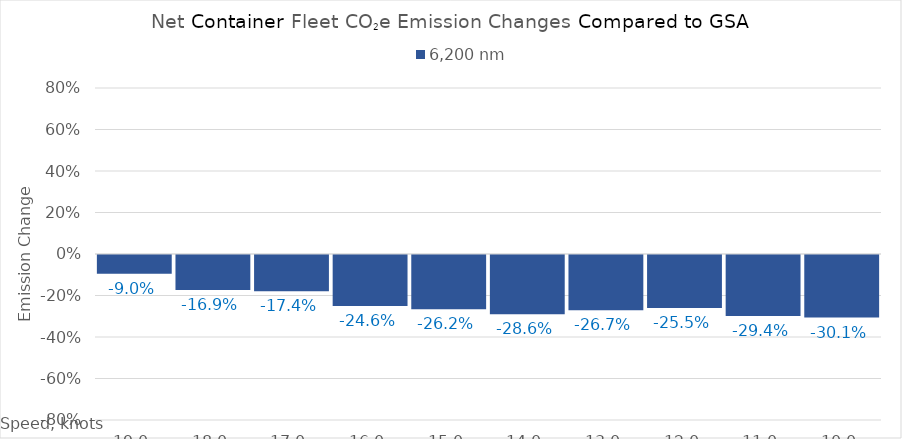
| Category | 6,200 |
|---|---|
| 19.0 | -0.09 |
| 18.0 | -0.169 |
| 17.0 | -0.174 |
| 16.0 | -0.246 |
| 15.0 | -0.262 |
| 14.0 | -0.286 |
| 13.0 | -0.267 |
| 12.0 | -0.255 |
| 11.0 | -0.294 |
| 10.0 | -0.301 |